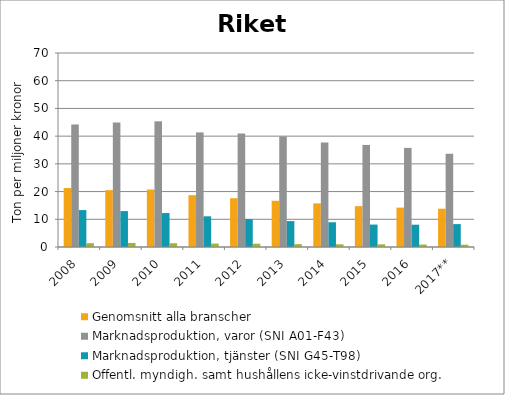
| Category | Genomsnitt alla branscher | Marknadsproduktion, varor (SNI A01-F43) | Marknadsproduktion, tjänster (SNI G45-T98) | Offentl. myndigh. samt hushållens icke-vinstdrivande org. |
|---|---|---|---|---|
| 2008 | 21.271 | 44.212 | 13.32 | 1.375 |
| 2009 | 20.51 | 44.942 | 12.958 | 1.459 |
| 2010 | 20.746 | 45.35 | 12.252 | 1.352 |
| 2011 | 18.704 | 41.347 | 11.072 | 1.239 |
| 2012 | 17.6 | 40.92 | 10.084 | 1.183 |
| 2013 | 16.671 | 39.911 | 9.348 | 1.036 |
| 2014 | 15.736 | 37.679 | 8.927 | 0.973 |
| 2015 | 14.735 | 36.829 | 8.087 | 0.958 |
| 2016 | 14.208 | 35.753 | 8.047 | 0.881 |
| 2017** | 13.818 | 33.602 | 8.264 | 0.825 |